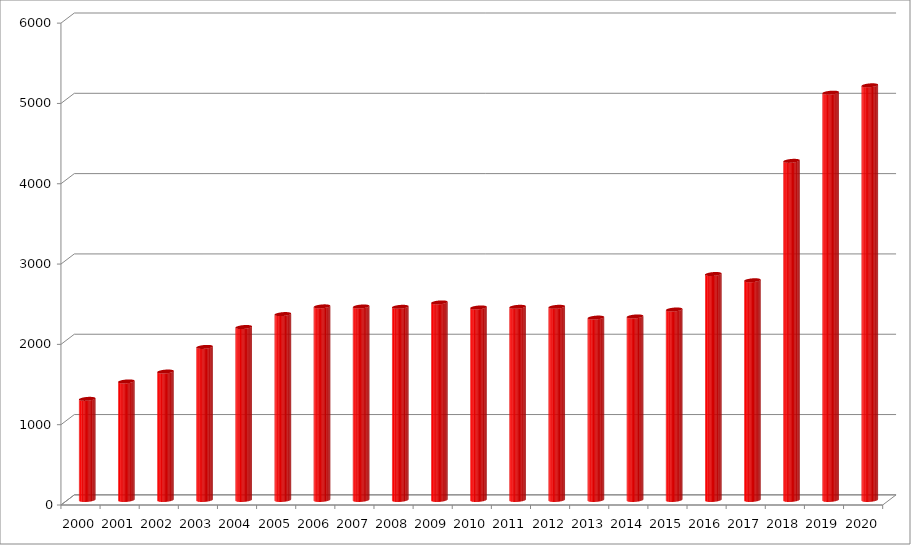
| Category | Series 0 |
|---|---|
| 2000.0 | 1258.5 |
| 2001.0 | 1475.5 |
| 2002.0 | 1598.5 |
| 2003.0 | 1905.5 |
| 2004.0 | 2153 |
| 2005.0 | 2314 |
| 2006.0 | 2410 |
| 2007.0 | 2408.5 |
| 2008.0 | 2404.5 |
| 2009.0 | 2459.5 |
| 2010.0 | 2396.5 |
| 2011.0 | 2404.5 |
| 2012.0 | 2404.5 |
| 2013.0 | 2270.5 |
| 2014.0 | 2284.5 |
| 2015.0 | 2371 |
| 2016.0 | 2813 |
| 2017.0 | 2735 |
| 2018.0 | 4222 |
| 2019.0 | 5071 |
| 2020.0 | 5162.5 |